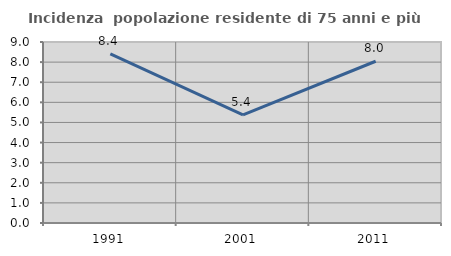
| Category | Incidenza  popolazione residente di 75 anni e più |
|---|---|
| 1991.0 | 8.408 |
| 2001.0 | 5.373 |
| 2011.0 | 8.043 |